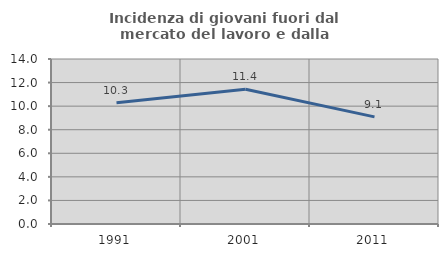
| Category | Incidenza di giovani fuori dal mercato del lavoro e dalla formazione  |
|---|---|
| 1991.0 | 10.284 |
| 2001.0 | 11.429 |
| 2011.0 | 9.091 |